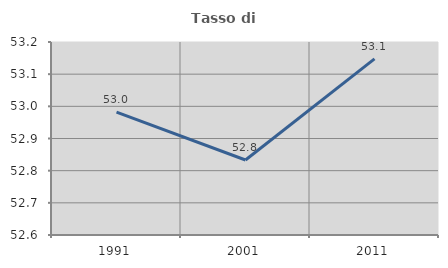
| Category | Tasso di occupazione   |
|---|---|
| 1991.0 | 52.982 |
| 2001.0 | 52.833 |
| 2011.0 | 53.148 |